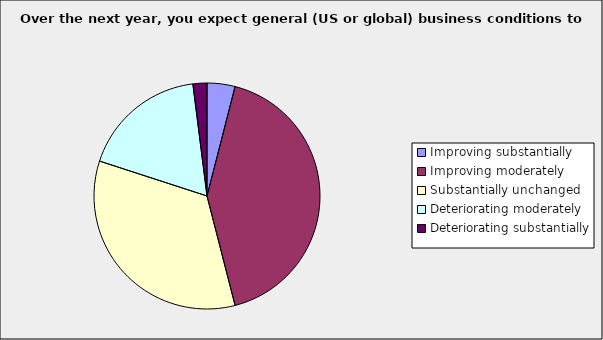
| Category | Series 0 |
|---|---|
| Improving substantially | 0.04 |
| Improving moderately | 0.42 |
| Substantially unchanged | 0.34 |
| Deteriorating moderately | 0.18 |
| Deteriorating substantially | 0.02 |